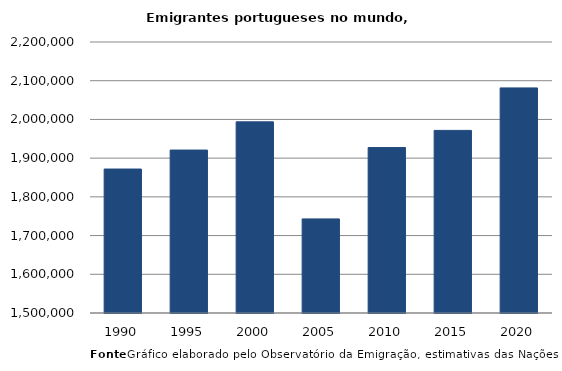
| Category | Series 0 |
|---|---|
| 1990.0 | 1871869 |
| 1995.0 | 1920865 |
| 2000.0 | 1993793 |
| 2005.0 | 1743009 |
| 2010.0 | 1927397 |
| 2015.0 | 1971655 |
| 2020.0 | 2081419 |